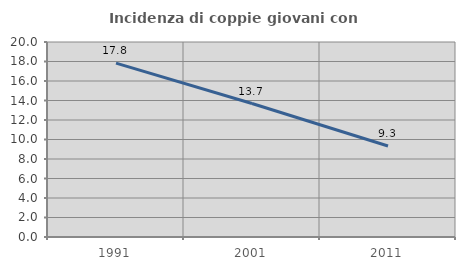
| Category | Incidenza di coppie giovani con figli |
|---|---|
| 1991.0 | 17.832 |
| 2001.0 | 13.69 |
| 2011.0 | 9.329 |